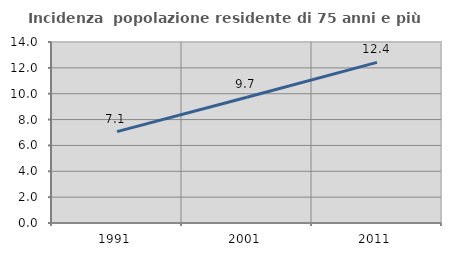
| Category | Incidenza  popolazione residente di 75 anni e più |
|---|---|
| 1991.0 | 7.071 |
| 2001.0 | 9.726 |
| 2011.0 | 12.426 |